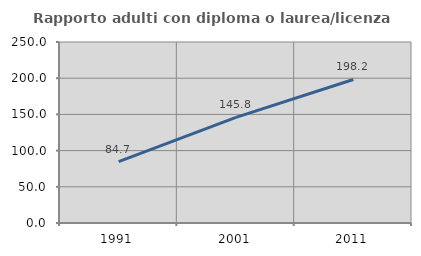
| Category | Rapporto adulti con diploma o laurea/licenza media  |
|---|---|
| 1991.0 | 84.725 |
| 2001.0 | 145.812 |
| 2011.0 | 198.207 |